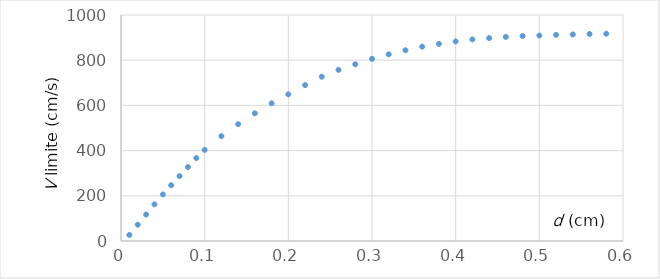
| Category | Series 0 |
|---|---|
| 0.01 | 27 |
| 0.02 | 72 |
| 0.03 | 117 |
| 0.04 | 162 |
| 0.05 | 206 |
| 0.06 | 247 |
| 0.07 | 287 |
| 0.08 | 327 |
| 0.09 | 367 |
| 0.1 | 403 |
| 0.12 | 464 |
| 0.14 | 517 |
| 0.16 | 565 |
| 0.18 | 609 |
| 0.2 | 649 |
| 0.22 | 690 |
| 0.24 | 727 |
| 0.26 | 757 |
| 0.28 | 782 |
| 0.3 | 806 |
| 0.32 | 826 |
| 0.34 | 844 |
| 0.36 | 860 |
| 0.38 | 872 |
| 0.4 | 883 |
| 0.42 | 892 |
| 0.44 | 898 |
| 0.46 | 903 |
| 0.48 | 907 |
| 0.5 | 909 |
| 0.52 | 912 |
| 0.54 | 914 |
| 0.56 | 916 |
| 0.58 | 917 |